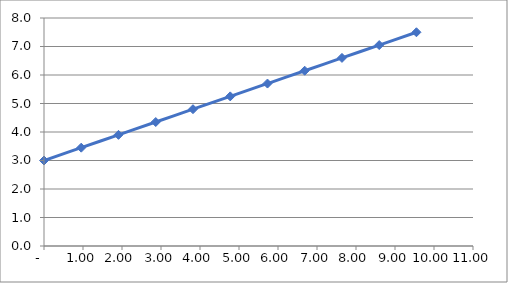
| Category | Series 0 |
|---|---|
| 0.0 | 3 |
| 0.9550000000000001 | 3.45 |
| 1.9100000000000001 | 3.9 |
| 2.865 | 4.35 |
| 3.8200000000000003 | 4.8 |
| 4.775 | 5.25 |
| 5.73 | 5.7 |
| 6.6850000000000005 | 6.15 |
| 7.640000000000001 | 6.6 |
| 8.595 | 7.05 |
| 9.55 | 7.5 |